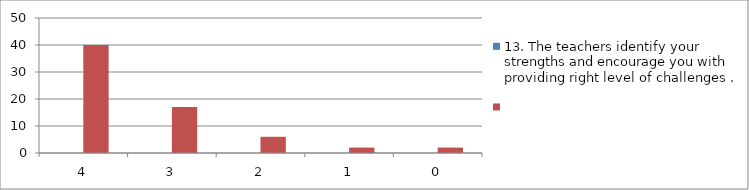
| Category | 13. The teachers identify your strengths and encourage you with providing right level of challenges . | Series 1 |
|---|---|---|
| 4.0 | 0 | 40 |
| 3.0 | 0 | 17 |
| 2.0 | 0 | 6 |
| 1.0 | 0 | 2 |
| 0.0 | 0 | 2 |